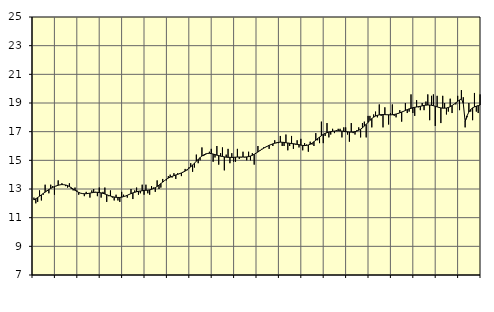
| Category | Finansiell verksamhet, företagstjänster, SNI 64-82 | Series 1 |
|---|---|---|
| nan | 12.4 | 12.24 |
| 1.0 | 12 | 12.32 |
| 1.0 | 12.1 | 12.4 |
| 1.0 | 12.9 | 12.5 |
| 1.0 | 12.2 | 12.59 |
| 1.0 | 12.6 | 12.69 |
| 1.0 | 13.3 | 12.78 |
| 1.0 | 12.9 | 12.87 |
| 1.0 | 12.7 | 12.96 |
| 1.0 | 13.3 | 13.04 |
| 1.0 | 13.2 | 13.11 |
| 1.0 | 12.6 | 13.17 |
| nan | 13.2 | 13.22 |
| 2.0 | 13.6 | 13.26 |
| 2.0 | 13.3 | 13.29 |
| 2.0 | 13.4 | 13.31 |
| 2.0 | 13.3 | 13.3 |
| 2.0 | 13.2 | 13.28 |
| 2.0 | 13.1 | 13.24 |
| 2.0 | 13.4 | 13.17 |
| 2.0 | 13 | 13.09 |
| 2.0 | 12.9 | 13 |
| 2.0 | 13.1 | 12.91 |
| 2.0 | 12.9 | 12.83 |
| nan | 12.6 | 12.76 |
| 3.0 | 12.7 | 12.71 |
| 3.0 | 12.7 | 12.68 |
| 3.0 | 12.5 | 12.67 |
| 3.0 | 12.8 | 12.67 |
| 3.0 | 12.7 | 12.69 |
| 3.0 | 12.4 | 12.71 |
| 3.0 | 12.9 | 12.74 |
| 3.0 | 13 | 12.76 |
| 3.0 | 12.8 | 12.77 |
| 3.0 | 12.5 | 12.77 |
| 3.0 | 13.1 | 12.75 |
| nan | 12.4 | 12.73 |
| 4.0 | 12.8 | 12.7 |
| 4.0 | 13.1 | 12.65 |
| 4.0 | 12.1 | 12.6 |
| 4.0 | 12.5 | 12.55 |
| 4.0 | 12.9 | 12.51 |
| 4.0 | 12.4 | 12.47 |
| 4.0 | 12.2 | 12.44 |
| 4.0 | 12.6 | 12.42 |
| 4.0 | 12.2 | 12.41 |
| 4.0 | 12.1 | 12.41 |
| 4.0 | 12.8 | 12.43 |
| nan | 12.6 | 12.47 |
| 5.0 | 12.5 | 12.51 |
| 5.0 | 12.4 | 12.56 |
| 5.0 | 12.6 | 12.62 |
| 5.0 | 13 | 12.68 |
| 5.0 | 12.3 | 12.73 |
| 5.0 | 12.9 | 12.77 |
| 5.0 | 13.1 | 12.81 |
| 5.0 | 12.6 | 12.84 |
| 5.0 | 12.7 | 12.86 |
| 5.0 | 13.3 | 12.88 |
| 5.0 | 12.6 | 12.9 |
| nan | 13.3 | 12.91 |
| 6.0 | 12.7 | 12.92 |
| 6.0 | 12.6 | 12.94 |
| 6.0 | 13.2 | 12.98 |
| 6.0 | 13.1 | 13.03 |
| 6.0 | 12.8 | 13.09 |
| 6.0 | 13.6 | 13.18 |
| 6.0 | 13 | 13.27 |
| 6.0 | 13.1 | 13.38 |
| 6.0 | 13.7 | 13.48 |
| 6.0 | 13.6 | 13.59 |
| 6.0 | 13.6 | 13.68 |
| nan | 13.9 | 13.76 |
| 7.0 | 14 | 13.83 |
| 7.0 | 13.8 | 13.88 |
| 7.0 | 14.1 | 13.93 |
| 7.0 | 13.7 | 13.98 |
| 7.0 | 14.1 | 14.02 |
| 7.0 | 14.1 | 14.07 |
| 7.0 | 13.9 | 14.12 |
| 7.0 | 14.2 | 14.18 |
| 7.0 | 14.4 | 14.25 |
| 7.0 | 14.3 | 14.34 |
| 7.0 | 14.5 | 14.44 |
| nan | 14.8 | 14.55 |
| 8.0 | 14.2 | 14.67 |
| 8.0 | 14.5 | 14.8 |
| 8.0 | 15.4 | 14.94 |
| 8.0 | 14.8 | 15.07 |
| 8.0 | 15 | 15.19 |
| 8.0 | 15.9 | 15.3 |
| 8.0 | 15.3 | 15.38 |
| 8.0 | 15.4 | 15.45 |
| 8.0 | 15.5 | 15.48 |
| 8.0 | 15.6 | 15.49 |
| 8.0 | 15.8 | 15.47 |
| nan | 14.9 | 15.44 |
| 9.0 | 15.2 | 15.4 |
| 9.0 | 16 | 15.36 |
| 9.0 | 14.7 | 15.33 |
| 9.0 | 15.5 | 15.29 |
| 9.0 | 15.9 | 15.27 |
| 9.0 | 14.3 | 15.24 |
| 9.0 | 15.4 | 15.22 |
| 9.0 | 15.8 | 15.21 |
| 9.0 | 14.8 | 15.21 |
| 9.0 | 15.5 | 15.2 |
| 9.0 | 14.9 | 15.21 |
| nan | 14.9 | 15.22 |
| 10.0 | 15.8 | 15.23 |
| 10.0 | 15.1 | 15.23 |
| 10.0 | 15.2 | 15.23 |
| 10.0 | 15.6 | 15.23 |
| 10.0 | 15.2 | 15.23 |
| 10.0 | 15 | 15.24 |
| 10.0 | 15.6 | 15.26 |
| 10.0 | 15 | 15.3 |
| 10.0 | 15.5 | 15.35 |
| 10.0 | 14.7 | 15.42 |
| 10.0 | 15.5 | 15.5 |
| nan | 16 | 15.58 |
| 11.0 | 15.7 | 15.67 |
| 11.0 | 15.8 | 15.76 |
| 11.0 | 15.9 | 15.84 |
| 11.0 | 15.9 | 15.92 |
| 11.0 | 16 | 15.98 |
| 11.0 | 15.8 | 16.05 |
| 11.0 | 16.1 | 16.1 |
| 11.0 | 16 | 16.15 |
| 11.0 | 16.4 | 16.19 |
| 11.0 | 16.2 | 16.23 |
| 11.0 | 16.2 | 16.25 |
| nan | 16.7 | 16.27 |
| 12.0 | 16 | 16.26 |
| 12.0 | 16 | 16.25 |
| 12.0 | 16.8 | 16.23 |
| 12.0 | 15.7 | 16.21 |
| 12.0 | 16 | 16.19 |
| 12.0 | 16.7 | 16.17 |
| 12.0 | 15.8 | 16.16 |
| 12.0 | 16.1 | 16.14 |
| 12.0 | 16.4 | 16.11 |
| 12.0 | 15.9 | 16.09 |
| 12.0 | 16.5 | 16.06 |
| nan | 15.7 | 16.04 |
| 13.0 | 16.2 | 16.03 |
| 13.0 | 16.1 | 16.04 |
| 13.0 | 15.6 | 16.07 |
| 13.0 | 16.3 | 16.12 |
| 13.0 | 16.1 | 16.2 |
| 13.0 | 16 | 16.3 |
| 13.0 | 16.9 | 16.4 |
| 13.0 | 16.4 | 16.52 |
| 13.0 | 16.2 | 16.62 |
| 13.0 | 17.7 | 16.72 |
| 13.0 | 16.2 | 16.81 |
| nan | 16.7 | 16.88 |
| 14.0 | 17.6 | 16.93 |
| 14.0 | 16.6 | 16.97 |
| 14.0 | 16.8 | 17 |
| 14.0 | 17.2 | 17.03 |
| 14.0 | 16.9 | 17.04 |
| 14.0 | 17.1 | 17.05 |
| 14.0 | 17.2 | 17.06 |
| 14.0 | 17.2 | 17.05 |
| 14.0 | 16.6 | 17.04 |
| 14.0 | 17.3 | 17.02 |
| 14.0 | 17.3 | 17 |
| nan | 16.8 | 16.99 |
| 15.0 | 16.3 | 16.97 |
| 15.0 | 17.6 | 16.97 |
| 15.0 | 16.9 | 16.98 |
| 15.0 | 16.8 | 17 |
| 15.0 | 17.1 | 17.04 |
| 15.0 | 17.3 | 17.1 |
| 15.0 | 16.6 | 17.17 |
| 15.0 | 17.6 | 17.27 |
| 15.0 | 17.7 | 17.39 |
| 15.0 | 16.6 | 17.51 |
| 15.0 | 18.1 | 17.65 |
| nan | 18.1 | 17.79 |
| 16.0 | 17.3 | 17.91 |
| 16.0 | 18.2 | 18.01 |
| 16.0 | 18.4 | 18.09 |
| 16.0 | 18 | 18.14 |
| 16.0 | 18.9 | 18.17 |
| 16.0 | 18.1 | 18.19 |
| 16.0 | 17.3 | 18.19 |
| 16.0 | 18.7 | 18.19 |
| 16.0 | 18.2 | 18.18 |
| 16.0 | 17.5 | 18.18 |
| 16.0 | 18.3 | 18.17 |
| nan | 18.9 | 18.18 |
| 17.0 | 18.1 | 18.2 |
| 17.0 | 18 | 18.23 |
| 17.0 | 18.3 | 18.27 |
| 17.0 | 18.5 | 18.31 |
| 17.0 | 17.7 | 18.37 |
| 17.0 | 18.4 | 18.42 |
| 17.0 | 19 | 18.48 |
| 17.0 | 18.3 | 18.54 |
| 17.0 | 18.4 | 18.59 |
| 17.0 | 19.6 | 18.63 |
| 17.0 | 18.3 | 18.67 |
| nan | 18.1 | 18.7 |
| 18.0 | 19.2 | 18.72 |
| 18.0 | 18.7 | 18.75 |
| 18.0 | 18.5 | 18.77 |
| 18.0 | 19 | 18.8 |
| 18.0 | 18.5 | 18.83 |
| 18.0 | 19.1 | 18.85 |
| 18.0 | 19.6 | 18.86 |
| 18.0 | 17.8 | 18.86 |
| 18.0 | 19.5 | 18.84 |
| 18.0 | 19.6 | 18.81 |
| 18.0 | 17.4 | 18.77 |
| nan | 19.5 | 18.73 |
| 19.0 | 18.7 | 18.69 |
| 19.0 | 17.6 | 18.66 |
| 19.0 | 19.5 | 18.64 |
| 19.0 | 19 | 18.64 |
| 19.0 | 18.2 | 18.65 |
| 19.0 | 18.4 | 18.69 |
| 19.0 | 19.3 | 18.74 |
| 19.0 | 18.3 | 18.82 |
| 19.0 | 18.9 | 18.91 |
| 19.0 | 18.9 | 19.01 |
| 19.0 | 19.5 | 19.11 |
| nan | 18.5 | 19.21 |
| 20.0 | 19.9 | 19.29 |
| 20.0 | 19.4 | 18.97 |
| 20.0 | 17.3 | 17.7 |
| 20.0 | 18 | 18.1 |
| 20.0 | 19 | 18.37 |
| 20.0 | 18.4 | 18.55 |
| 20.0 | 17.8 | 18.66 |
| 20.0 | 19.7 | 18.73 |
| 20.0 | 18.4 | 18.78 |
| 20.0 | 18.3 | 18.82 |
| 20.0 | 19.6 | 18.86 |